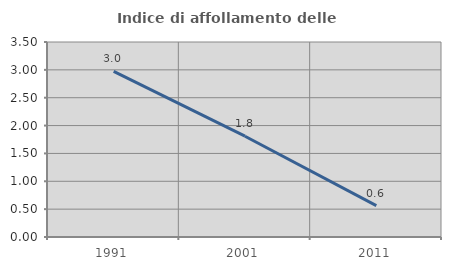
| Category | Indice di affollamento delle abitazioni  |
|---|---|
| 1991.0 | 2.972 |
| 2001.0 | 1.809 |
| 2011.0 | 0.563 |